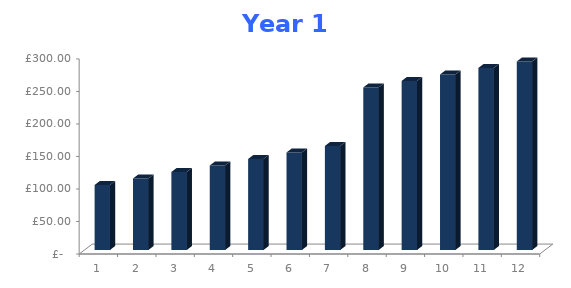
| Category | Series 1 |
|---|---|
| 0 | 100 |
| 1 | 110 |
| 2 | 120 |
| 3 | 130 |
| 4 | 140 |
| 5 | 150 |
| 6 | 160 |
| 7 | 250 |
| 8 | 260 |
| 9 | 270 |
| 10 | 280 |
| 11 | 290 |